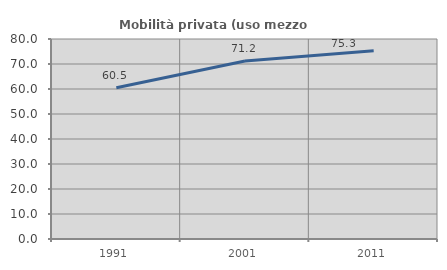
| Category | Mobilità privata (uso mezzo privato) |
|---|---|
| 1991.0 | 60.505 |
| 2001.0 | 71.199 |
| 2011.0 | 75.265 |